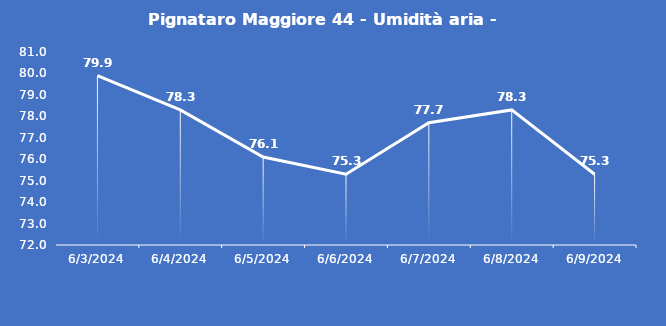
| Category | Pignataro Maggiore 44 - Umidità aria - Grezzo (%) |
|---|---|
| 6/3/24 | 79.9 |
| 6/4/24 | 78.3 |
| 6/5/24 | 76.1 |
| 6/6/24 | 75.3 |
| 6/7/24 | 77.7 |
| 6/8/24 | 78.3 |
| 6/9/24 | 75.3 |